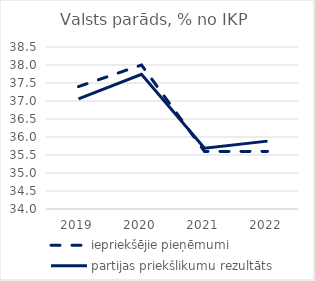
| Category | iepriekšējie pieņēmumi | partijas priekšlikumu rezultāts |
|---|---|---|
| 2019.0 | 37.4 | 37.061 |
| 2020.0 | 38 | 37.741 |
| 2021.0 | 35.6 | 35.688 |
| 2022.0 | 35.6 | 35.885 |